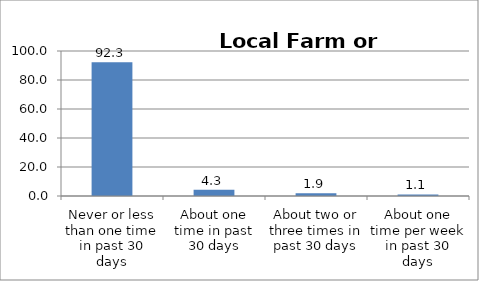
| Category | Series 0 |
|---|---|
| Never or less than one time in past 30 days | 92.302 |
| About one time in past 30 days | 4.295 |
| About two or three times in past 30 days | 1.92 |
| About one time per week in past 30 days | 1.071 |